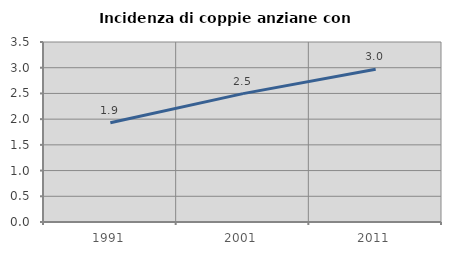
| Category | Incidenza di coppie anziane con figli |
|---|---|
| 1991.0 | 1.93 |
| 2001.0 | 2.496 |
| 2011.0 | 2.969 |